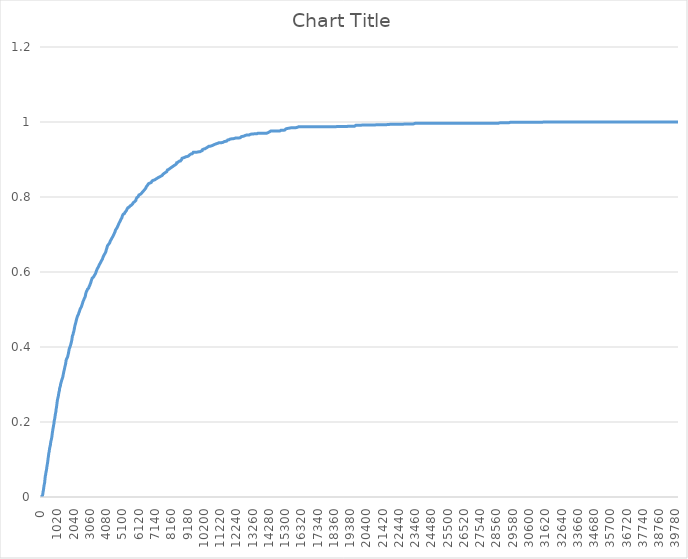
| Category | Series 0 |
|---|---|
| 0.0 | 0 |
| 20.0 | 0 |
| 40.0 | 0.001 |
| 60.0 | 0.002 |
| 80.0 | 0.004 |
| 100.0 | 0.007 |
| 120.0 | 0.014 |
| 140.0 | 0.018 |
| 160.0 | 0.024 |
| 180.0 | 0.031 |
| 200.0 | 0.034 |
| 220.0 | 0.039 |
| 240.0 | 0.048 |
| 260.0 | 0.056 |
| 280.0 | 0.059 |
| 300.0 | 0.066 |
| 320.0 | 0.068 |
| 340.0 | 0.074 |
| 360.0 | 0.081 |
| 380.0 | 0.085 |
| 400.0 | 0.091 |
| 420.0 | 0.097 |
| 440.0 | 0.104 |
| 460.0 | 0.11 |
| 480.0 | 0.117 |
| 500.0 | 0.12 |
| 520.0 | 0.127 |
| 540.0 | 0.132 |
| 560.0 | 0.135 |
| 580.0 | 0.139 |
| 600.0 | 0.147 |
| 620.0 | 0.149 |
| 640.0 | 0.153 |
| 660.0 | 0.157 |
| 680.0 | 0.164 |
| 700.0 | 0.171 |
| 720.0 | 0.176 |
| 740.0 | 0.182 |
| 760.0 | 0.186 |
| 780.0 | 0.191 |
| 800.0 | 0.196 |
| 820.0 | 0.203 |
| 840.0 | 0.207 |
| 860.0 | 0.211 |
| 880.0 | 0.218 |
| 900.0 | 0.223 |
| 920.0 | 0.226 |
| 940.0 | 0.235 |
| 960.0 | 0.239 |
| 980.0 | 0.245 |
| 1000.0 | 0.253 |
| 1020.0 | 0.258 |
| 1040.0 | 0.261 |
| 1060.0 | 0.266 |
| 1080.0 | 0.27 |
| 1100.0 | 0.276 |
| 1120.0 | 0.28 |
| 1140.0 | 0.283 |
| 1160.0 | 0.29 |
| 1180.0 | 0.292 |
| 1200.0 | 0.295 |
| 1220.0 | 0.301 |
| 1240.0 | 0.304 |
| 1260.0 | 0.305 |
| 1280.0 | 0.31 |
| 1300.0 | 0.313 |
| 1320.0 | 0.315 |
| 1340.0 | 0.318 |
| 1360.0 | 0.321 |
| 1380.0 | 0.326 |
| 1400.0 | 0.33 |
| 1420.0 | 0.334 |
| 1440.0 | 0.338 |
| 1460.0 | 0.341 |
| 1480.0 | 0.346 |
| 1500.0 | 0.348 |
| 1520.0 | 0.353 |
| 1540.0 | 0.356 |
| 1560.0 | 0.363 |
| 1580.0 | 0.367 |
| 1600.0 | 0.369 |
| 1620.0 | 0.37 |
| 1640.0 | 0.372 |
| 1660.0 | 0.374 |
| 1680.0 | 0.378 |
| 1700.0 | 0.381 |
| 1720.0 | 0.383 |
| 1740.0 | 0.39 |
| 1760.0 | 0.395 |
| 1780.0 | 0.397 |
| 1800.0 | 0.399 |
| 1820.0 | 0.401 |
| 1840.0 | 0.404 |
| 1860.0 | 0.405 |
| 1880.0 | 0.411 |
| 1900.0 | 0.414 |
| 1920.0 | 0.418 |
| 1940.0 | 0.424 |
| 1960.0 | 0.43 |
| 1980.0 | 0.431 |
| 2000.0 | 0.433 |
| 2020.0 | 0.438 |
| 2040.0 | 0.44 |
| 2060.0 | 0.443 |
| 2080.0 | 0.448 |
| 2100.0 | 0.453 |
| 2120.0 | 0.457 |
| 2140.0 | 0.46 |
| 2160.0 | 0.463 |
| 2180.0 | 0.465 |
| 2200.0 | 0.471 |
| 2220.0 | 0.473 |
| 2240.0 | 0.477 |
| 2260.0 | 0.479 |
| 2280.0 | 0.483 |
| 2300.0 | 0.484 |
| 2320.0 | 0.485 |
| 2340.0 | 0.487 |
| 2360.0 | 0.491 |
| 2380.0 | 0.492 |
| 2400.0 | 0.495 |
| 2420.0 | 0.495 |
| 2440.0 | 0.501 |
| 2460.0 | 0.502 |
| 2480.0 | 0.503 |
| 2500.0 | 0.503 |
| 2520.0 | 0.507 |
| 2540.0 | 0.509 |
| 2560.0 | 0.512 |
| 2580.0 | 0.514 |
| 2600.0 | 0.518 |
| 2620.0 | 0.521 |
| 2640.0 | 0.523 |
| 2660.0 | 0.524 |
| 2680.0 | 0.526 |
| 2700.0 | 0.527 |
| 2720.0 | 0.531 |
| 2740.0 | 0.532 |
| 2760.0 | 0.534 |
| 2780.0 | 0.538 |
| 2800.0 | 0.542 |
| 2820.0 | 0.545 |
| 2840.0 | 0.548 |
| 2860.0 | 0.549 |
| 2880.0 | 0.551 |
| 2900.0 | 0.554 |
| 2920.0 | 0.555 |
| 2940.0 | 0.556 |
| 2960.0 | 0.556 |
| 2980.0 | 0.557 |
| 3000.0 | 0.56 |
| 3020.0 | 0.562 |
| 3040.0 | 0.564 |
| 3060.0 | 0.566 |
| 3080.0 | 0.568 |
| 3100.0 | 0.571 |
| 3120.0 | 0.573 |
| 3140.0 | 0.576 |
| 3160.0 | 0.578 |
| 3180.0 | 0.581 |
| 3200.0 | 0.584 |
| 3220.0 | 0.585 |
| 3240.0 | 0.585 |
| 3260.0 | 0.586 |
| 3280.0 | 0.586 |
| 3300.0 | 0.586 |
| 3320.0 | 0.588 |
| 3340.0 | 0.591 |
| 3360.0 | 0.591 |
| 3380.0 | 0.592 |
| 3400.0 | 0.595 |
| 3420.0 | 0.598 |
| 3440.0 | 0.6 |
| 3460.0 | 0.602 |
| 3480.0 | 0.604 |
| 3500.0 | 0.607 |
| 3520.0 | 0.607 |
| 3540.0 | 0.609 |
| 3560.0 | 0.612 |
| 3580.0 | 0.613 |
| 3600.0 | 0.614 |
| 3620.0 | 0.617 |
| 3640.0 | 0.619 |
| 3660.0 | 0.62 |
| 3680.0 | 0.622 |
| 3700.0 | 0.623 |
| 3720.0 | 0.625 |
| 3740.0 | 0.625 |
| 3760.0 | 0.626 |
| 3780.0 | 0.63 |
| 3800.0 | 0.631 |
| 3820.0 | 0.631 |
| 3840.0 | 0.634 |
| 3860.0 | 0.637 |
| 3880.0 | 0.638 |
| 3900.0 | 0.642 |
| 3920.0 | 0.644 |
| 3940.0 | 0.644 |
| 3960.0 | 0.647 |
| 3980.0 | 0.648 |
| 4000.0 | 0.649 |
| 4020.0 | 0.651 |
| 4040.0 | 0.653 |
| 4060.0 | 0.654 |
| 4080.0 | 0.659 |
| 4100.0 | 0.66 |
| 4120.0 | 0.663 |
| 4140.0 | 0.667 |
| 4160.0 | 0.67 |
| 4180.0 | 0.671 |
| 4200.0 | 0.672 |
| 4220.0 | 0.673 |
| 4240.0 | 0.675 |
| 4260.0 | 0.675 |
| 4280.0 | 0.676 |
| 4300.0 | 0.678 |
| 4320.0 | 0.681 |
| 4340.0 | 0.682 |
| 4360.0 | 0.684 |
| 4380.0 | 0.686 |
| 4400.0 | 0.686 |
| 4420.0 | 0.689 |
| 4440.0 | 0.689 |
| 4460.0 | 0.692 |
| 4480.0 | 0.694 |
| 4500.0 | 0.695 |
| 4520.0 | 0.697 |
| 4540.0 | 0.697 |
| 4560.0 | 0.7 |
| 4580.0 | 0.702 |
| 4600.0 | 0.704 |
| 4620.0 | 0.706 |
| 4640.0 | 0.708 |
| 4660.0 | 0.711 |
| 4680.0 | 0.712 |
| 4700.0 | 0.714 |
| 4720.0 | 0.714 |
| 4740.0 | 0.716 |
| 4760.0 | 0.718 |
| 4780.0 | 0.72 |
| 4800.0 | 0.722 |
| 4820.0 | 0.724 |
| 4840.0 | 0.726 |
| 4860.0 | 0.727 |
| 4880.0 | 0.73 |
| 4900.0 | 0.731 |
| 4920.0 | 0.733 |
| 4940.0 | 0.735 |
| 4960.0 | 0.736 |
| 4980.0 | 0.738 |
| 5000.0 | 0.74 |
| 5020.0 | 0.74 |
| 5040.0 | 0.741 |
| 5060.0 | 0.744 |
| 5080.0 | 0.747 |
| 5100.0 | 0.75 |
| 5120.0 | 0.751 |
| 5140.0 | 0.754 |
| 5160.0 | 0.755 |
| 5180.0 | 0.755 |
| 5200.0 | 0.755 |
| 5220.0 | 0.756 |
| 5240.0 | 0.757 |
| 5260.0 | 0.759 |
| 5280.0 | 0.76 |
| 5300.0 | 0.76 |
| 5320.0 | 0.762 |
| 5340.0 | 0.763 |
| 5360.0 | 0.766 |
| 5380.0 | 0.767 |
| 5400.0 | 0.768 |
| 5420.0 | 0.769 |
| 5440.0 | 0.771 |
| 5460.0 | 0.772 |
| 5480.0 | 0.772 |
| 5500.0 | 0.772 |
| 5520.0 | 0.773 |
| 5540.0 | 0.774 |
| 5560.0 | 0.775 |
| 5580.0 | 0.776 |
| 5600.0 | 0.776 |
| 5620.0 | 0.777 |
| 5640.0 | 0.778 |
| 5660.0 | 0.778 |
| 5680.0 | 0.778 |
| 5700.0 | 0.78 |
| 5720.0 | 0.78 |
| 5740.0 | 0.782 |
| 5760.0 | 0.784 |
| 5780.0 | 0.785 |
| 5800.0 | 0.785 |
| 5820.0 | 0.785 |
| 5840.0 | 0.788 |
| 5860.0 | 0.788 |
| 5880.0 | 0.788 |
| 5900.0 | 0.789 |
| 5920.0 | 0.789 |
| 5940.0 | 0.791 |
| 5960.0 | 0.795 |
| 5980.0 | 0.797 |
| 6000.0 | 0.798 |
| 6020.0 | 0.799 |
| 6040.0 | 0.8 |
| 6060.0 | 0.8 |
| 6080.0 | 0.801 |
| 6100.0 | 0.803 |
| 6120.0 | 0.803 |
| 6140.0 | 0.806 |
| 6160.0 | 0.806 |
| 6180.0 | 0.806 |
| 6200.0 | 0.806 |
| 6220.0 | 0.807 |
| 6240.0 | 0.809 |
| 6260.0 | 0.809 |
| 6280.0 | 0.809 |
| 6300.0 | 0.81 |
| 6320.0 | 0.812 |
| 6340.0 | 0.812 |
| 6360.0 | 0.813 |
| 6380.0 | 0.815 |
| 6400.0 | 0.815 |
| 6420.0 | 0.815 |
| 6440.0 | 0.817 |
| 6460.0 | 0.818 |
| 6480.0 | 0.819 |
| 6500.0 | 0.82 |
| 6520.0 | 0.821 |
| 6540.0 | 0.822 |
| 6560.0 | 0.823 |
| 6580.0 | 0.826 |
| 6600.0 | 0.828 |
| 6620.0 | 0.828 |
| 6640.0 | 0.829 |
| 6660.0 | 0.831 |
| 6680.0 | 0.831 |
| 6700.0 | 0.831 |
| 6720.0 | 0.832 |
| 6740.0 | 0.836 |
| 6760.0 | 0.836 |
| 6780.0 | 0.836 |
| 6800.0 | 0.837 |
| 6820.0 | 0.837 |
| 6840.0 | 0.837 |
| 6860.0 | 0.837 |
| 6880.0 | 0.837 |
| 6900.0 | 0.839 |
| 6920.0 | 0.839 |
| 6940.0 | 0.84 |
| 6960.0 | 0.843 |
| 6980.0 | 0.844 |
| 7000.0 | 0.844 |
| 7020.0 | 0.844 |
| 7040.0 | 0.845 |
| 7060.0 | 0.845 |
| 7080.0 | 0.845 |
| 7100.0 | 0.845 |
| 7120.0 | 0.846 |
| 7140.0 | 0.846 |
| 7160.0 | 0.846 |
| 7180.0 | 0.847 |
| 7200.0 | 0.848 |
| 7220.0 | 0.848 |
| 7240.0 | 0.849 |
| 7260.0 | 0.849 |
| 7280.0 | 0.85 |
| 7300.0 | 0.851 |
| 7320.0 | 0.852 |
| 7340.0 | 0.852 |
| 7360.0 | 0.852 |
| 7380.0 | 0.853 |
| 7400.0 | 0.853 |
| 7420.0 | 0.853 |
| 7440.0 | 0.854 |
| 7460.0 | 0.855 |
| 7480.0 | 0.855 |
| 7500.0 | 0.856 |
| 7520.0 | 0.856 |
| 7540.0 | 0.856 |
| 7560.0 | 0.857 |
| 7580.0 | 0.857 |
| 7600.0 | 0.858 |
| 7620.0 | 0.858 |
| 7640.0 | 0.861 |
| 7660.0 | 0.861 |
| 7680.0 | 0.861 |
| 7700.0 | 0.863 |
| 7720.0 | 0.863 |
| 7740.0 | 0.864 |
| 7760.0 | 0.865 |
| 7780.0 | 0.866 |
| 7800.0 | 0.866 |
| 7820.0 | 0.866 |
| 7840.0 | 0.866 |
| 7860.0 | 0.867 |
| 7880.0 | 0.868 |
| 7900.0 | 0.87 |
| 7920.0 | 0.872 |
| 7940.0 | 0.873 |
| 7960.0 | 0.874 |
| 7980.0 | 0.874 |
| 8000.0 | 0.874 |
| 8020.0 | 0.875 |
| 8040.0 | 0.875 |
| 8060.0 | 0.875 |
| 8080.0 | 0.876 |
| 8100.0 | 0.876 |
| 8120.0 | 0.878 |
| 8140.0 | 0.878 |
| 8160.0 | 0.879 |
| 8180.0 | 0.879 |
| 8200.0 | 0.88 |
| 8220.0 | 0.881 |
| 8240.0 | 0.881 |
| 8260.0 | 0.881 |
| 8280.0 | 0.881 |
| 8300.0 | 0.883 |
| 8320.0 | 0.883 |
| 8340.0 | 0.884 |
| 8360.0 | 0.884 |
| 8380.0 | 0.885 |
| 8400.0 | 0.886 |
| 8420.0 | 0.886 |
| 8440.0 | 0.886 |
| 8460.0 | 0.887 |
| 8480.0 | 0.888 |
| 8500.0 | 0.891 |
| 8520.0 | 0.891 |
| 8540.0 | 0.891 |
| 8560.0 | 0.892 |
| 8580.0 | 0.892 |
| 8600.0 | 0.893 |
| 8620.0 | 0.893 |
| 8640.0 | 0.894 |
| 8660.0 | 0.896 |
| 8680.0 | 0.896 |
| 8700.0 | 0.896 |
| 8720.0 | 0.896 |
| 8740.0 | 0.896 |
| 8760.0 | 0.896 |
| 8780.0 | 0.898 |
| 8800.0 | 0.899 |
| 8820.0 | 0.901 |
| 8840.0 | 0.903 |
| 8860.0 | 0.903 |
| 8880.0 | 0.903 |
| 8900.0 | 0.903 |
| 8920.0 | 0.904 |
| 8940.0 | 0.904 |
| 8960.0 | 0.905 |
| 8980.0 | 0.905 |
| 9000.0 | 0.906 |
| 9020.0 | 0.906 |
| 9040.0 | 0.906 |
| 9060.0 | 0.907 |
| 9080.0 | 0.907 |
| 9100.0 | 0.907 |
| 9120.0 | 0.908 |
| 9140.0 | 0.908 |
| 9160.0 | 0.908 |
| 9180.0 | 0.909 |
| 9200.0 | 0.909 |
| 9220.0 | 0.909 |
| 9240.0 | 0.909 |
| 9260.0 | 0.909 |
| 9280.0 | 0.91 |
| 9300.0 | 0.912 |
| 9320.0 | 0.912 |
| 9340.0 | 0.914 |
| 9360.0 | 0.914 |
| 9380.0 | 0.914 |
| 9400.0 | 0.915 |
| 9420.0 | 0.915 |
| 9440.0 | 0.915 |
| 9460.0 | 0.915 |
| 9480.0 | 0.915 |
| 9500.0 | 0.917 |
| 9520.0 | 0.918 |
| 9540.0 | 0.919 |
| 9560.0 | 0.919 |
| 9580.0 | 0.92 |
| 9600.0 | 0.92 |
| 9620.0 | 0.92 |
| 9640.0 | 0.92 |
| 9660.0 | 0.92 |
| 9680.0 | 0.92 |
| 9700.0 | 0.92 |
| 9720.0 | 0.92 |
| 9740.0 | 0.92 |
| 9760.0 | 0.92 |
| 9780.0 | 0.92 |
| 9800.0 | 0.92 |
| 9820.0 | 0.92 |
| 9840.0 | 0.92 |
| 9860.0 | 0.92 |
| 9880.0 | 0.92 |
| 9900.0 | 0.92 |
| 9920.0 | 0.92 |
| 9940.0 | 0.92 |
| 9960.0 | 0.92 |
| 9980.0 | 0.921 |
| 10000.0 | 0.922 |
| 10020.0 | 0.922 |
| 10040.0 | 0.923 |
| 10060.0 | 0.923 |
| 10080.0 | 0.924 |
| 10100.0 | 0.924 |
| 10120.0 | 0.926 |
| 10140.0 | 0.926 |
| 10160.0 | 0.926 |
| 10180.0 | 0.928 |
| 10200.0 | 0.928 |
| 10220.0 | 0.928 |
| 10240.0 | 0.929 |
| 10260.0 | 0.929 |
| 10280.0 | 0.929 |
| 10300.0 | 0.931 |
| 10320.0 | 0.931 |
| 10340.0 | 0.931 |
| 10360.0 | 0.931 |
| 10380.0 | 0.932 |
| 10400.0 | 0.932 |
| 10420.0 | 0.933 |
| 10440.0 | 0.933 |
| 10460.0 | 0.934 |
| 10480.0 | 0.934 |
| 10500.0 | 0.935 |
| 10520.0 | 0.935 |
| 10540.0 | 0.935 |
| 10560.0 | 0.935 |
| 10580.0 | 0.935 |
| 10600.0 | 0.935 |
| 10620.0 | 0.935 |
| 10640.0 | 0.935 |
| 10660.0 | 0.936 |
| 10680.0 | 0.936 |
| 10700.0 | 0.936 |
| 10720.0 | 0.936 |
| 10740.0 | 0.937 |
| 10760.0 | 0.938 |
| 10780.0 | 0.939 |
| 10800.0 | 0.939 |
| 10820.0 | 0.939 |
| 10840.0 | 0.939 |
| 10860.0 | 0.94 |
| 10880.0 | 0.941 |
| 10900.0 | 0.941 |
| 10920.0 | 0.941 |
| 10940.0 | 0.942 |
| 10960.0 | 0.942 |
| 10980.0 | 0.942 |
| 11000.0 | 0.942 |
| 11020.0 | 0.943 |
| 11040.0 | 0.943 |
| 11060.0 | 0.943 |
| 11080.0 | 0.943 |
| 11100.0 | 0.944 |
| 11120.0 | 0.945 |
| 11140.0 | 0.945 |
| 11160.0 | 0.945 |
| 11180.0 | 0.945 |
| 11200.0 | 0.945 |
| 11220.0 | 0.945 |
| 11240.0 | 0.945 |
| 11260.0 | 0.945 |
| 11280.0 | 0.945 |
| 11300.0 | 0.945 |
| 11320.0 | 0.945 |
| 11340.0 | 0.945 |
| 11360.0 | 0.945 |
| 11380.0 | 0.945 |
| 11400.0 | 0.946 |
| 11420.0 | 0.948 |
| 11440.0 | 0.948 |
| 11460.0 | 0.948 |
| 11480.0 | 0.948 |
| 11500.0 | 0.948 |
| 11520.0 | 0.948 |
| 11540.0 | 0.948 |
| 11560.0 | 0.948 |
| 11580.0 | 0.949 |
| 11600.0 | 0.949 |
| 11620.0 | 0.949 |
| 11640.0 | 0.949 |
| 11660.0 | 0.949 |
| 11680.0 | 0.95 |
| 11700.0 | 0.952 |
| 11720.0 | 0.952 |
| 11740.0 | 0.952 |
| 11760.0 | 0.953 |
| 11780.0 | 0.953 |
| 11800.0 | 0.953 |
| 11820.0 | 0.954 |
| 11840.0 | 0.954 |
| 11860.0 | 0.954 |
| 11880.0 | 0.954 |
| 11900.0 | 0.954 |
| 11920.0 | 0.955 |
| 11940.0 | 0.955 |
| 11960.0 | 0.955 |
| 11980.0 | 0.955 |
| 12000.0 | 0.955 |
| 12020.0 | 0.955 |
| 12040.0 | 0.956 |
| 12060.0 | 0.956 |
| 12080.0 | 0.956 |
| 12100.0 | 0.956 |
| 12120.0 | 0.957 |
| 12140.0 | 0.957 |
| 12160.0 | 0.957 |
| 12180.0 | 0.957 |
| 12200.0 | 0.957 |
| 12220.0 | 0.957 |
| 12240.0 | 0.957 |
| 12260.0 | 0.957 |
| 12280.0 | 0.957 |
| 12300.0 | 0.957 |
| 12320.0 | 0.957 |
| 12340.0 | 0.957 |
| 12360.0 | 0.957 |
| 12380.0 | 0.957 |
| 12400.0 | 0.957 |
| 12420.0 | 0.957 |
| 12440.0 | 0.957 |
| 12460.0 | 0.957 |
| 12480.0 | 0.958 |
| 12500.0 | 0.958 |
| 12520.0 | 0.958 |
| 12540.0 | 0.958 |
| 12560.0 | 0.961 |
| 12580.0 | 0.961 |
| 12600.0 | 0.962 |
| 12620.0 | 0.962 |
| 12640.0 | 0.962 |
| 12660.0 | 0.962 |
| 12680.0 | 0.962 |
| 12700.0 | 0.962 |
| 12720.0 | 0.962 |
| 12740.0 | 0.963 |
| 12760.0 | 0.963 |
| 12780.0 | 0.963 |
| 12800.0 | 0.964 |
| 12820.0 | 0.964 |
| 12840.0 | 0.965 |
| 12860.0 | 0.965 |
| 12880.0 | 0.965 |
| 12900.0 | 0.965 |
| 12920.0 | 0.965 |
| 12940.0 | 0.965 |
| 12960.0 | 0.965 |
| 12980.0 | 0.965 |
| 13000.0 | 0.965 |
| 13020.0 | 0.965 |
| 13040.0 | 0.965 |
| 13060.0 | 0.965 |
| 13080.0 | 0.966 |
| 13100.0 | 0.967 |
| 13120.0 | 0.967 |
| 13140.0 | 0.968 |
| 13160.0 | 0.968 |
| 13180.0 | 0.968 |
| 13200.0 | 0.968 |
| 13220.0 | 0.968 |
| 13240.0 | 0.968 |
| 13260.0 | 0.968 |
| 13280.0 | 0.968 |
| 13300.0 | 0.968 |
| 13320.0 | 0.968 |
| 13340.0 | 0.968 |
| 13360.0 | 0.968 |
| 13380.0 | 0.968 |
| 13400.0 | 0.968 |
| 13420.0 | 0.968 |
| 13440.0 | 0.968 |
| 13460.0 | 0.968 |
| 13480.0 | 0.968 |
| 13500.0 | 0.968 |
| 13520.0 | 0.968 |
| 13540.0 | 0.968 |
| 13560.0 | 0.97 |
| 13580.0 | 0.97 |
| 13600.0 | 0.97 |
| 13620.0 | 0.97 |
| 13640.0 | 0.97 |
| 13660.0 | 0.97 |
| 13680.0 | 0.97 |
| 13700.0 | 0.97 |
| 13720.0 | 0.97 |
| 13740.0 | 0.97 |
| 13760.0 | 0.97 |
| 13780.0 | 0.97 |
| 13800.0 | 0.97 |
| 13820.0 | 0.97 |
| 13840.0 | 0.97 |
| 13860.0 | 0.97 |
| 13880.0 | 0.97 |
| 13900.0 | 0.97 |
| 13920.0 | 0.97 |
| 13940.0 | 0.97 |
| 13960.0 | 0.97 |
| 13980.0 | 0.97 |
| 14000.0 | 0.97 |
| 14020.0 | 0.97 |
| 14040.0 | 0.97 |
| 14060.0 | 0.97 |
| 14080.0 | 0.97 |
| 14100.0 | 0.97 |
| 14120.0 | 0.97 |
| 14140.0 | 0.97 |
| 14160.0 | 0.97 |
| 14180.0 | 0.97 |
| 14200.0 | 0.971 |
| 14220.0 | 0.971 |
| 14240.0 | 0.972 |
| 14260.0 | 0.973 |
| 14280.0 | 0.973 |
| 14300.0 | 0.973 |
| 14320.0 | 0.974 |
| 14340.0 | 0.974 |
| 14360.0 | 0.975 |
| 14380.0 | 0.975 |
| 14400.0 | 0.976 |
| 14420.0 | 0.976 |
| 14440.0 | 0.976 |
| 14460.0 | 0.976 |
| 14480.0 | 0.976 |
| 14500.0 | 0.976 |
| 14520.0 | 0.976 |
| 14540.0 | 0.976 |
| 14560.0 | 0.976 |
| 14580.0 | 0.976 |
| 14600.0 | 0.976 |
| 14620.0 | 0.976 |
| 14640.0 | 0.976 |
| 14660.0 | 0.976 |
| 14680.0 | 0.976 |
| 14700.0 | 0.976 |
| 14720.0 | 0.976 |
| 14740.0 | 0.976 |
| 14760.0 | 0.976 |
| 14780.0 | 0.976 |
| 14800.0 | 0.976 |
| 14820.0 | 0.976 |
| 14840.0 | 0.976 |
| 14860.0 | 0.976 |
| 14880.0 | 0.976 |
| 14900.0 | 0.976 |
| 14920.0 | 0.976 |
| 14940.0 | 0.976 |
| 14960.0 | 0.976 |
| 14980.0 | 0.976 |
| 15000.0 | 0.976 |
| 15020.0 | 0.978 |
| 15040.0 | 0.978 |
| 15060.0 | 0.978 |
| 15080.0 | 0.978 |
| 15100.0 | 0.978 |
| 15120.0 | 0.978 |
| 15140.0 | 0.978 |
| 15160.0 | 0.978 |
| 15180.0 | 0.978 |
| 15200.0 | 0.978 |
| 15220.0 | 0.979 |
| 15240.0 | 0.979 |
| 15260.0 | 0.979 |
| 15280.0 | 0.979 |
| 15300.0 | 0.979 |
| 15320.0 | 0.981 |
| 15340.0 | 0.981 |
| 15360.0 | 0.982 |
| 15380.0 | 0.982 |
| 15400.0 | 0.982 |
| 15420.0 | 0.982 |
| 15440.0 | 0.982 |
| 15460.0 | 0.982 |
| 15480.0 | 0.983 |
| 15500.0 | 0.983 |
| 15520.0 | 0.983 |
| 15540.0 | 0.984 |
| 15560.0 | 0.984 |
| 15580.0 | 0.984 |
| 15600.0 | 0.984 |
| 15620.0 | 0.984 |
| 15640.0 | 0.984 |
| 15660.0 | 0.984 |
| 15680.0 | 0.984 |
| 15700.0 | 0.984 |
| 15720.0 | 0.984 |
| 15740.0 | 0.984 |
| 15760.0 | 0.984 |
| 15780.0 | 0.985 |
| 15800.0 | 0.985 |
| 15820.0 | 0.985 |
| 15840.0 | 0.985 |
| 15860.0 | 0.985 |
| 15880.0 | 0.985 |
| 15900.0 | 0.985 |
| 15920.0 | 0.985 |
| 15940.0 | 0.985 |
| 15960.0 | 0.985 |
| 15980.0 | 0.985 |
| 16000.0 | 0.986 |
| 16020.0 | 0.986 |
| 16040.0 | 0.986 |
| 16060.0 | 0.986 |
| 16080.0 | 0.986 |
| 16100.0 | 0.987 |
| 16120.0 | 0.987 |
| 16140.0 | 0.987 |
| 16160.0 | 0.987 |
| 16180.0 | 0.987 |
| 16200.0 | 0.987 |
| 16220.0 | 0.987 |
| 16240.0 | 0.987 |
| 16260.0 | 0.987 |
| 16280.0 | 0.987 |
| 16300.0 | 0.987 |
| 16320.0 | 0.987 |
| 16340.0 | 0.987 |
| 16360.0 | 0.987 |
| 16380.0 | 0.987 |
| 16400.0 | 0.987 |
| 16420.0 | 0.987 |
| 16440.0 | 0.987 |
| 16460.0 | 0.987 |
| 16480.0 | 0.987 |
| 16500.0 | 0.987 |
| 16520.0 | 0.987 |
| 16540.0 | 0.987 |
| 16560.0 | 0.987 |
| 16580.0 | 0.987 |
| 16600.0 | 0.987 |
| 16620.0 | 0.987 |
| 16640.0 | 0.987 |
| 16660.0 | 0.987 |
| 16680.0 | 0.987 |
| 16700.0 | 0.987 |
| 16720.0 | 0.987 |
| 16740.0 | 0.987 |
| 16760.0 | 0.987 |
| 16780.0 | 0.987 |
| 16800.0 | 0.987 |
| 16820.0 | 0.987 |
| 16840.0 | 0.987 |
| 16860.0 | 0.987 |
| 16880.0 | 0.987 |
| 16900.0 | 0.987 |
| 16920.0 | 0.987 |
| 16940.0 | 0.987 |
| 16960.0 | 0.987 |
| 16980.0 | 0.987 |
| 17000.0 | 0.987 |
| 17020.0 | 0.987 |
| 17040.0 | 0.987 |
| 17060.0 | 0.987 |
| 17080.0 | 0.987 |
| 17100.0 | 0.987 |
| 17120.0 | 0.987 |
| 17140.0 | 0.987 |
| 17160.0 | 0.987 |
| 17180.0 | 0.987 |
| 17200.0 | 0.987 |
| 17220.0 | 0.987 |
| 17240.0 | 0.987 |
| 17260.0 | 0.987 |
| 17280.0 | 0.987 |
| 17300.0 | 0.987 |
| 17320.0 | 0.987 |
| 17340.0 | 0.987 |
| 17360.0 | 0.987 |
| 17380.0 | 0.987 |
| 17400.0 | 0.987 |
| 17420.0 | 0.987 |
| 17440.0 | 0.987 |
| 17460.0 | 0.987 |
| 17480.0 | 0.987 |
| 17500.0 | 0.987 |
| 17520.0 | 0.987 |
| 17540.0 | 0.987 |
| 17560.0 | 0.987 |
| 17580.0 | 0.987 |
| 17600.0 | 0.987 |
| 17620.0 | 0.987 |
| 17640.0 | 0.987 |
| 17660.0 | 0.987 |
| 17680.0 | 0.987 |
| 17700.0 | 0.987 |
| 17720.0 | 0.987 |
| 17740.0 | 0.987 |
| 17760.0 | 0.987 |
| 17780.0 | 0.987 |
| 17800.0 | 0.987 |
| 17820.0 | 0.987 |
| 17840.0 | 0.987 |
| 17860.0 | 0.987 |
| 17880.0 | 0.987 |
| 17900.0 | 0.987 |
| 17920.0 | 0.987 |
| 17940.0 | 0.987 |
| 17960.0 | 0.987 |
| 17980.0 | 0.987 |
| 18000.0 | 0.987 |
| 18020.0 | 0.987 |
| 18040.0 | 0.987 |
| 18060.0 | 0.987 |
| 18080.0 | 0.987 |
| 18100.0 | 0.987 |
| 18120.0 | 0.987 |
| 18140.0 | 0.987 |
| 18160.0 | 0.987 |
| 18180.0 | 0.987 |
| 18200.0 | 0.987 |
| 18220.0 | 0.987 |
| 18240.0 | 0.987 |
| 18260.0 | 0.987 |
| 18280.0 | 0.987 |
| 18300.0 | 0.987 |
| 18320.0 | 0.987 |
| 18340.0 | 0.987 |
| 18360.0 | 0.987 |
| 18380.0 | 0.987 |
| 18400.0 | 0.987 |
| 18420.0 | 0.987 |
| 18440.0 | 0.987 |
| 18460.0 | 0.987 |
| 18480.0 | 0.987 |
| 18500.0 | 0.987 |
| 18520.0 | 0.988 |
| 18540.0 | 0.988 |
| 18560.0 | 0.988 |
| 18580.0 | 0.988 |
| 18600.0 | 0.988 |
| 18620.0 | 0.988 |
| 18640.0 | 0.988 |
| 18660.0 | 0.988 |
| 18680.0 | 0.988 |
| 18700.0 | 0.988 |
| 18720.0 | 0.988 |
| 18740.0 | 0.988 |
| 18760.0 | 0.988 |
| 18780.0 | 0.988 |
| 18800.0 | 0.988 |
| 18820.0 | 0.988 |
| 18840.0 | 0.988 |
| 18860.0 | 0.988 |
| 18880.0 | 0.988 |
| 18900.0 | 0.988 |
| 18920.0 | 0.988 |
| 18940.0 | 0.988 |
| 18960.0 | 0.988 |
| 18980.0 | 0.988 |
| 19000.0 | 0.988 |
| 19020.0 | 0.988 |
| 19040.0 | 0.988 |
| 19060.0 | 0.988 |
| 19080.0 | 0.988 |
| 19100.0 | 0.988 |
| 19120.0 | 0.988 |
| 19140.0 | 0.988 |
| 19160.0 | 0.988 |
| 19180.0 | 0.988 |
| 19200.0 | 0.989 |
| 19220.0 | 0.989 |
| 19240.0 | 0.989 |
| 19260.0 | 0.989 |
| 19280.0 | 0.989 |
| 19300.0 | 0.989 |
| 19320.0 | 0.989 |
| 19340.0 | 0.989 |
| 19360.0 | 0.989 |
| 19380.0 | 0.989 |
| 19400.0 | 0.989 |
| 19420.0 | 0.989 |
| 19440.0 | 0.989 |
| 19460.0 | 0.989 |
| 19480.0 | 0.989 |
| 19500.0 | 0.989 |
| 19520.0 | 0.989 |
| 19540.0 | 0.989 |
| 19560.0 | 0.989 |
| 19580.0 | 0.989 |
| 19600.0 | 0.989 |
| 19620.0 | 0.989 |
| 19640.0 | 0.989 |
| 19660.0 | 0.989 |
| 19680.0 | 0.991 |
| 19700.0 | 0.991 |
| 19720.0 | 0.991 |
| 19740.0 | 0.991 |
| 19760.0 | 0.991 |
| 19780.0 | 0.991 |
| 19800.0 | 0.991 |
| 19820.0 | 0.991 |
| 19840.0 | 0.991 |
| 19860.0 | 0.991 |
| 19880.0 | 0.991 |
| 19900.0 | 0.991 |
| 19920.0 | 0.991 |
| 19940.0 | 0.991 |
| 19960.0 | 0.991 |
| 19980.0 | 0.991 |
| 20000.0 | 0.991 |
| 20020.0 | 0.991 |
| 20040.0 | 0.991 |
| 20060.0 | 0.991 |
| 20080.0 | 0.991 |
| 20100.0 | 0.991 |
| 20120.0 | 0.991 |
| 20140.0 | 0.992 |
| 20160.0 | 0.992 |
| 20180.0 | 0.992 |
| 20200.0 | 0.992 |
| 20220.0 | 0.992 |
| 20240.0 | 0.992 |
| 20260.0 | 0.992 |
| 20280.0 | 0.992 |
| 20300.0 | 0.992 |
| 20320.0 | 0.992 |
| 20340.0 | 0.992 |
| 20360.0 | 0.992 |
| 20380.0 | 0.992 |
| 20400.0 | 0.992 |
| 20420.0 | 0.992 |
| 20440.0 | 0.992 |
| 20460.0 | 0.992 |
| 20480.0 | 0.992 |
| 20500.0 | 0.992 |
| 20520.0 | 0.992 |
| 20540.0 | 0.992 |
| 20560.0 | 0.992 |
| 20580.0 | 0.992 |
| 20600.0 | 0.992 |
| 20620.0 | 0.992 |
| 20640.0 | 0.992 |
| 20660.0 | 0.992 |
| 20680.0 | 0.992 |
| 20700.0 | 0.992 |
| 20720.0 | 0.992 |
| 20740.0 | 0.992 |
| 20760.0 | 0.992 |
| 20780.0 | 0.992 |
| 20800.0 | 0.992 |
| 20820.0 | 0.992 |
| 20840.0 | 0.992 |
| 20860.0 | 0.992 |
| 20880.0 | 0.992 |
| 20900.0 | 0.992 |
| 20920.0 | 0.992 |
| 20940.0 | 0.992 |
| 20960.0 | 0.992 |
| 20980.0 | 0.993 |
| 21000.0 | 0.993 |
| 21020.0 | 0.993 |
| 21040.0 | 0.993 |
| 21060.0 | 0.993 |
| 21080.0 | 0.993 |
| 21100.0 | 0.993 |
| 21120.0 | 0.993 |
| 21140.0 | 0.993 |
| 21160.0 | 0.993 |
| 21180.0 | 0.993 |
| 21200.0 | 0.993 |
| 21220.0 | 0.993 |
| 21240.0 | 0.993 |
| 21260.0 | 0.993 |
| 21280.0 | 0.993 |
| 21300.0 | 0.993 |
| 21320.0 | 0.993 |
| 21340.0 | 0.993 |
| 21360.0 | 0.993 |
| 21380.0 | 0.993 |
| 21400.0 | 0.993 |
| 21420.0 | 0.993 |
| 21440.0 | 0.993 |
| 21460.0 | 0.993 |
| 21480.0 | 0.993 |
| 21500.0 | 0.993 |
| 21520.0 | 0.993 |
| 21540.0 | 0.993 |
| 21560.0 | 0.993 |
| 21580.0 | 0.993 |
| 21600.0 | 0.993 |
| 21620.0 | 0.993 |
| 21640.0 | 0.993 |
| 21660.0 | 0.993 |
| 21680.0 | 0.993 |
| 21700.0 | 0.993 |
| 21720.0 | 0.993 |
| 21740.0 | 0.993 |
| 21760.0 | 0.993 |
| 21780.0 | 0.993 |
| 21800.0 | 0.993 |
| 21820.0 | 0.993 |
| 21840.0 | 0.993 |
| 21860.0 | 0.993 |
| 21880.0 | 0.994 |
| 21900.0 | 0.994 |
| 21920.0 | 0.994 |
| 21940.0 | 0.994 |
| 21960.0 | 0.994 |
| 21980.0 | 0.994 |
| 22000.0 | 0.994 |
| 22020.0 | 0.994 |
| 22040.0 | 0.994 |
| 22060.0 | 0.994 |
| 22080.0 | 0.994 |
| 22100.0 | 0.994 |
| 22120.0 | 0.994 |
| 22140.0 | 0.994 |
| 22160.0 | 0.994 |
| 22180.0 | 0.994 |
| 22200.0 | 0.994 |
| 22220.0 | 0.994 |
| 22240.0 | 0.994 |
| 22260.0 | 0.994 |
| 22280.0 | 0.994 |
| 22300.0 | 0.994 |
| 22320.0 | 0.994 |
| 22340.0 | 0.994 |
| 22360.0 | 0.994 |
| 22380.0 | 0.994 |
| 22400.0 | 0.994 |
| 22420.0 | 0.994 |
| 22440.0 | 0.994 |
| 22460.0 | 0.994 |
| 22480.0 | 0.994 |
| 22500.0 | 0.994 |
| 22520.0 | 0.994 |
| 22540.0 | 0.994 |
| 22560.0 | 0.994 |
| 22580.0 | 0.994 |
| 22600.0 | 0.994 |
| 22620.0 | 0.994 |
| 22640.0 | 0.994 |
| 22660.0 | 0.994 |
| 22680.0 | 0.994 |
| 22700.0 | 0.994 |
| 22720.0 | 0.995 |
| 22740.0 | 0.995 |
| 22760.0 | 0.995 |
| 22780.0 | 0.995 |
| 22800.0 | 0.995 |
| 22820.0 | 0.995 |
| 22840.0 | 0.995 |
| 22860.0 | 0.995 |
| 22880.0 | 0.995 |
| 22900.0 | 0.995 |
| 22920.0 | 0.995 |
| 22940.0 | 0.995 |
| 22960.0 | 0.995 |
| 22980.0 | 0.995 |
| 23000.0 | 0.995 |
| 23020.0 | 0.995 |
| 23040.0 | 0.995 |
| 23060.0 | 0.995 |
| 23080.0 | 0.995 |
| 23100.0 | 0.995 |
| 23120.0 | 0.995 |
| 23140.0 | 0.995 |
| 23160.0 | 0.995 |
| 23180.0 | 0.995 |
| 23200.0 | 0.995 |
| 23220.0 | 0.995 |
| 23240.0 | 0.995 |
| 23260.0 | 0.995 |
| 23280.0 | 0.995 |
| 23300.0 | 0.995 |
| 23320.0 | 0.995 |
| 23340.0 | 0.995 |
| 23360.0 | 0.995 |
| 23380.0 | 0.995 |
| 23400.0 | 0.996 |
| 23420.0 | 0.996 |
| 23440.0 | 0.996 |
| 23460.0 | 0.996 |
| 23480.0 | 0.997 |
| 23500.0 | 0.997 |
| 23520.0 | 0.997 |
| 23540.0 | 0.997 |
| 23560.0 | 0.997 |
| 23580.0 | 0.997 |
| 23600.0 | 0.997 |
| 23620.0 | 0.997 |
| 23640.0 | 0.997 |
| 23660.0 | 0.997 |
| 23680.0 | 0.997 |
| 23700.0 | 0.997 |
| 23720.0 | 0.997 |
| 23740.0 | 0.997 |
| 23760.0 | 0.997 |
| 23780.0 | 0.997 |
| 23800.0 | 0.997 |
| 23820.0 | 0.997 |
| 23840.0 | 0.997 |
| 23860.0 | 0.997 |
| 23880.0 | 0.997 |
| 23900.0 | 0.997 |
| 23920.0 | 0.997 |
| 23940.0 | 0.997 |
| 23960.0 | 0.997 |
| 23980.0 | 0.997 |
| 24000.0 | 0.997 |
| 24020.0 | 0.997 |
| 24040.0 | 0.997 |
| 24060.0 | 0.997 |
| 24080.0 | 0.997 |
| 24100.0 | 0.997 |
| 24120.0 | 0.997 |
| 24140.0 | 0.997 |
| 24160.0 | 0.997 |
| 24180.0 | 0.997 |
| 24200.0 | 0.997 |
| 24220.0 | 0.997 |
| 24240.0 | 0.997 |
| 24260.0 | 0.997 |
| 24280.0 | 0.997 |
| 24300.0 | 0.997 |
| 24320.0 | 0.997 |
| 24340.0 | 0.997 |
| 24360.0 | 0.997 |
| 24380.0 | 0.997 |
| 24400.0 | 0.997 |
| 24420.0 | 0.997 |
| 24440.0 | 0.997 |
| 24460.0 | 0.997 |
| 24480.0 | 0.997 |
| 24500.0 | 0.997 |
| 24520.0 | 0.997 |
| 24540.0 | 0.997 |
| 24560.0 | 0.997 |
| 24580.0 | 0.997 |
| 24600.0 | 0.997 |
| 24620.0 | 0.997 |
| 24640.0 | 0.997 |
| 24660.0 | 0.997 |
| 24680.0 | 0.997 |
| 24700.0 | 0.997 |
| 24720.0 | 0.997 |
| 24740.0 | 0.997 |
| 24760.0 | 0.997 |
| 24780.0 | 0.997 |
| 24800.0 | 0.997 |
| 24820.0 | 0.997 |
| 24840.0 | 0.997 |
| 24860.0 | 0.997 |
| 24880.0 | 0.997 |
| 24900.0 | 0.997 |
| 24920.0 | 0.997 |
| 24940.0 | 0.997 |
| 24960.0 | 0.997 |
| 24980.0 | 0.997 |
| 25000.0 | 0.997 |
| 25020.0 | 0.997 |
| 25040.0 | 0.997 |
| 25060.0 | 0.997 |
| 25080.0 | 0.997 |
| 25100.0 | 0.997 |
| 25120.0 | 0.997 |
| 25140.0 | 0.997 |
| 25160.0 | 0.997 |
| 25180.0 | 0.997 |
| 25200.0 | 0.997 |
| 25220.0 | 0.997 |
| 25240.0 | 0.997 |
| 25260.0 | 0.997 |
| 25280.0 | 0.997 |
| 25300.0 | 0.997 |
| 25320.0 | 0.997 |
| 25340.0 | 0.997 |
| 25360.0 | 0.997 |
| 25380.0 | 0.997 |
| 25400.0 | 0.997 |
| 25420.0 | 0.997 |
| 25440.0 | 0.997 |
| 25460.0 | 0.997 |
| 25480.0 | 0.997 |
| 25500.0 | 0.997 |
| 25520.0 | 0.997 |
| 25540.0 | 0.997 |
| 25560.0 | 0.997 |
| 25580.0 | 0.997 |
| 25600.0 | 0.997 |
| 25620.0 | 0.997 |
| 25640.0 | 0.997 |
| 25660.0 | 0.997 |
| 25680.0 | 0.997 |
| 25700.0 | 0.997 |
| 25720.0 | 0.997 |
| 25740.0 | 0.997 |
| 25760.0 | 0.997 |
| 25780.0 | 0.997 |
| 25800.0 | 0.997 |
| 25820.0 | 0.997 |
| 25840.0 | 0.997 |
| 25860.0 | 0.997 |
| 25880.0 | 0.997 |
| 25900.0 | 0.997 |
| 25920.0 | 0.997 |
| 25940.0 | 0.997 |
| 25960.0 | 0.997 |
| 25980.0 | 0.997 |
| 26000.0 | 0.997 |
| 26020.0 | 0.997 |
| 26040.0 | 0.997 |
| 26060.0 | 0.997 |
| 26080.0 | 0.997 |
| 26100.0 | 0.997 |
| 26120.0 | 0.997 |
| 26140.0 | 0.997 |
| 26160.0 | 0.997 |
| 26180.0 | 0.997 |
| 26200.0 | 0.997 |
| 26220.0 | 0.997 |
| 26240.0 | 0.997 |
| 26260.0 | 0.997 |
| 26280.0 | 0.997 |
| 26300.0 | 0.997 |
| 26320.0 | 0.997 |
| 26340.0 | 0.997 |
| 26360.0 | 0.997 |
| 26380.0 | 0.997 |
| 26400.0 | 0.997 |
| 26420.0 | 0.997 |
| 26440.0 | 0.997 |
| 26460.0 | 0.997 |
| 26480.0 | 0.997 |
| 26500.0 | 0.997 |
| 26520.0 | 0.997 |
| 26540.0 | 0.997 |
| 26560.0 | 0.997 |
| 26580.0 | 0.997 |
| 26600.0 | 0.997 |
| 26620.0 | 0.997 |
| 26640.0 | 0.997 |
| 26660.0 | 0.997 |
| 26680.0 | 0.997 |
| 26700.0 | 0.997 |
| 26720.0 | 0.997 |
| 26740.0 | 0.997 |
| 26760.0 | 0.997 |
| 26780.0 | 0.997 |
| 26800.0 | 0.997 |
| 26820.0 | 0.997 |
| 26840.0 | 0.997 |
| 26860.0 | 0.997 |
| 26880.0 | 0.997 |
| 26900.0 | 0.997 |
| 26920.0 | 0.997 |
| 26940.0 | 0.997 |
| 26960.0 | 0.997 |
| 26980.0 | 0.997 |
| 27000.0 | 0.997 |
| 27020.0 | 0.997 |
| 27040.0 | 0.997 |
| 27060.0 | 0.997 |
| 27080.0 | 0.997 |
| 27100.0 | 0.997 |
| 27120.0 | 0.997 |
| 27140.0 | 0.997 |
| 27160.0 | 0.997 |
| 27180.0 | 0.997 |
| 27200.0 | 0.997 |
| 27220.0 | 0.997 |
| 27240.0 | 0.997 |
| 27260.0 | 0.997 |
| 27280.0 | 0.997 |
| 27300.0 | 0.997 |
| 27320.0 | 0.997 |
| 27340.0 | 0.997 |
| 27360.0 | 0.997 |
| 27380.0 | 0.997 |
| 27400.0 | 0.997 |
| 27420.0 | 0.997 |
| 27440.0 | 0.997 |
| 27460.0 | 0.997 |
| 27480.0 | 0.997 |
| 27500.0 | 0.997 |
| 27520.0 | 0.997 |
| 27540.0 | 0.997 |
| 27560.0 | 0.997 |
| 27580.0 | 0.997 |
| 27600.0 | 0.997 |
| 27620.0 | 0.997 |
| 27640.0 | 0.997 |
| 27660.0 | 0.997 |
| 27680.0 | 0.997 |
| 27700.0 | 0.997 |
| 27720.0 | 0.997 |
| 27740.0 | 0.997 |
| 27760.0 | 0.997 |
| 27780.0 | 0.997 |
| 27800.0 | 0.997 |
| 27820.0 | 0.997 |
| 27840.0 | 0.997 |
| 27860.0 | 0.997 |
| 27880.0 | 0.997 |
| 27900.0 | 0.997 |
| 27920.0 | 0.997 |
| 27940.0 | 0.997 |
| 27960.0 | 0.997 |
| 27980.0 | 0.997 |
| 28000.0 | 0.997 |
| 28020.0 | 0.997 |
| 28040.0 | 0.997 |
| 28060.0 | 0.997 |
| 28080.0 | 0.997 |
| 28100.0 | 0.997 |
| 28120.0 | 0.997 |
| 28140.0 | 0.997 |
| 28160.0 | 0.997 |
| 28180.0 | 0.997 |
| 28200.0 | 0.997 |
| 28220.0 | 0.997 |
| 28240.0 | 0.997 |
| 28260.0 | 0.997 |
| 28280.0 | 0.997 |
| 28300.0 | 0.997 |
| 28320.0 | 0.997 |
| 28340.0 | 0.997 |
| 28360.0 | 0.997 |
| 28380.0 | 0.997 |
| 28400.0 | 0.997 |
| 28420.0 | 0.997 |
| 28440.0 | 0.997 |
| 28460.0 | 0.997 |
| 28480.0 | 0.997 |
| 28500.0 | 0.997 |
| 28520.0 | 0.997 |
| 28540.0 | 0.997 |
| 28560.0 | 0.997 |
| 28580.0 | 0.997 |
| 28600.0 | 0.997 |
| 28620.0 | 0.997 |
| 28640.0 | 0.997 |
| 28660.0 | 0.997 |
| 28680.0 | 0.997 |
| 28700.0 | 0.997 |
| 28720.0 | 0.997 |
| 28740.0 | 0.998 |
| 28760.0 | 0.998 |
| 28780.0 | 0.998 |
| 28800.0 | 0.998 |
| 28820.0 | 0.998 |
| 28840.0 | 0.998 |
| 28860.0 | 0.998 |
| 28880.0 | 0.998 |
| 28900.0 | 0.998 |
| 28920.0 | 0.998 |
| 28940.0 | 0.998 |
| 28960.0 | 0.998 |
| 28980.0 | 0.998 |
| 29000.0 | 0.998 |
| 29020.0 | 0.998 |
| 29040.0 | 0.998 |
| 29060.0 | 0.998 |
| 29080.0 | 0.998 |
| 29100.0 | 0.998 |
| 29120.0 | 0.998 |
| 29140.0 | 0.998 |
| 29160.0 | 0.998 |
| 29180.0 | 0.998 |
| 29200.0 | 0.998 |
| 29220.0 | 0.998 |
| 29240.0 | 0.998 |
| 29260.0 | 0.998 |
| 29280.0 | 0.998 |
| 29300.0 | 0.998 |
| 29320.0 | 0.998 |
| 29340.0 | 0.998 |
| 29360.0 | 0.998 |
| 29380.0 | 0.998 |
| 29400.0 | 0.999 |
| 29420.0 | 0.999 |
| 29440.0 | 0.999 |
| 29460.0 | 0.999 |
| 29480.0 | 0.999 |
| 29500.0 | 0.999 |
| 29520.0 | 0.999 |
| 29540.0 | 0.999 |
| 29560.0 | 0.999 |
| 29580.0 | 0.999 |
| 29600.0 | 0.999 |
| 29620.0 | 0.999 |
| 29640.0 | 0.999 |
| 29660.0 | 0.999 |
| 29680.0 | 0.999 |
| 29700.0 | 0.999 |
| 29720.0 | 0.999 |
| 29740.0 | 0.999 |
| 29760.0 | 0.999 |
| 29780.0 | 0.999 |
| 29800.0 | 0.999 |
| 29820.0 | 0.999 |
| 29840.0 | 0.999 |
| 29860.0 | 0.999 |
| 29880.0 | 0.999 |
| 29900.0 | 0.999 |
| 29920.0 | 0.999 |
| 29940.0 | 0.999 |
| 29960.0 | 0.999 |
| 29980.0 | 0.999 |
| 30000.0 | 0.999 |
| 30020.0 | 0.999 |
| 30040.0 | 0.999 |
| 30060.0 | 0.999 |
| 30080.0 | 0.999 |
| 30100.0 | 0.999 |
| 30120.0 | 0.999 |
| 30140.0 | 0.999 |
| 30160.0 | 0.999 |
| 30180.0 | 0.999 |
| 30200.0 | 0.999 |
| 30220.0 | 0.999 |
| 30240.0 | 0.999 |
| 30260.0 | 0.999 |
| 30280.0 | 0.999 |
| 30300.0 | 0.999 |
| 30320.0 | 0.999 |
| 30340.0 | 0.999 |
| 30360.0 | 0.999 |
| 30380.0 | 0.999 |
| 30400.0 | 0.999 |
| 30420.0 | 0.999 |
| 30440.0 | 0.999 |
| 30460.0 | 0.999 |
| 30480.0 | 0.999 |
| 30500.0 | 0.999 |
| 30520.0 | 0.999 |
| 30540.0 | 0.999 |
| 30560.0 | 0.999 |
| 30580.0 | 0.999 |
| 30600.0 | 0.999 |
| 30620.0 | 0.999 |
| 30640.0 | 0.999 |
| 30660.0 | 0.999 |
| 30680.0 | 0.999 |
| 30700.0 | 0.999 |
| 30720.0 | 0.999 |
| 30740.0 | 0.999 |
| 30760.0 | 0.999 |
| 30780.0 | 0.999 |
| 30800.0 | 0.999 |
| 30820.0 | 0.999 |
| 30840.0 | 0.999 |
| 30860.0 | 0.999 |
| 30880.0 | 0.999 |
| 30900.0 | 0.999 |
| 30920.0 | 0.999 |
| 30940.0 | 0.999 |
| 30960.0 | 0.999 |
| 30980.0 | 0.999 |
| 31000.0 | 0.999 |
| 31020.0 | 0.999 |
| 31040.0 | 0.999 |
| 31060.0 | 0.999 |
| 31080.0 | 0.999 |
| 31100.0 | 0.999 |
| 31120.0 | 0.999 |
| 31140.0 | 0.999 |
| 31160.0 | 0.999 |
| 31180.0 | 0.999 |
| 31200.0 | 0.999 |
| 31220.0 | 0.999 |
| 31240.0 | 0.999 |
| 31260.0 | 0.999 |
| 31280.0 | 0.999 |
| 31300.0 | 0.999 |
| 31320.0 | 0.999 |
| 31340.0 | 0.999 |
| 31360.0 | 0.999 |
| 31380.0 | 0.999 |
| 31400.0 | 0.999 |
| 31420.0 | 0.999 |
| 31440.0 | 1 |
| 31460.0 | 1 |
| 31480.0 | 1 |
| 31500.0 | 1 |
| 31520.0 | 1 |
| 31540.0 | 1 |
| 31560.0 | 1 |
| 31580.0 | 1 |
| 31600.0 | 1 |
| 31620.0 | 1 |
| 31640.0 | 1 |
| 31660.0 | 1 |
| 31680.0 | 1 |
| 31700.0 | 1 |
| 31720.0 | 1 |
| 31740.0 | 1 |
| 31760.0 | 1 |
| 31780.0 | 1 |
| 31800.0 | 1 |
| 31820.0 | 1 |
| 31840.0 | 1 |
| 31860.0 | 1 |
| 31880.0 | 1 |
| 31900.0 | 1 |
| 31920.0 | 1 |
| 31940.0 | 1 |
| 31960.0 | 1 |
| 31980.0 | 1 |
| 32000.0 | 1 |
| 32020.0 | 1 |
| 32040.0 | 1 |
| 32060.0 | 1 |
| 32080.0 | 1 |
| 32100.0 | 1 |
| 32120.0 | 1 |
| 32140.0 | 1 |
| 32160.0 | 1 |
| 32180.0 | 1 |
| 32200.0 | 1 |
| 32220.0 | 1 |
| 32240.0 | 1 |
| 32260.0 | 1 |
| 32280.0 | 1 |
| 32300.0 | 1 |
| 32320.0 | 1 |
| 32340.0 | 1 |
| 32360.0 | 1 |
| 32380.0 | 1 |
| 32400.0 | 1 |
| 32420.0 | 1 |
| 32440.0 | 1 |
| 32460.0 | 1 |
| 32480.0 | 1 |
| 32500.0 | 1 |
| 32520.0 | 1 |
| 32540.0 | 1 |
| 32560.0 | 1 |
| 32580.0 | 1 |
| 32600.0 | 1 |
| 32620.0 | 1 |
| 32640.0 | 1 |
| 32660.0 | 1 |
| 32680.0 | 1 |
| 32700.0 | 1 |
| 32720.0 | 1 |
| 32740.0 | 1 |
| 32760.0 | 1 |
| 32780.0 | 1 |
| 32800.0 | 1 |
| 32820.0 | 1 |
| 32840.0 | 1 |
| 32860.0 | 1 |
| 32880.0 | 1 |
| 32900.0 | 1 |
| 32920.0 | 1 |
| 32940.0 | 1 |
| 32960.0 | 1 |
| 32980.0 | 1 |
| 33000.0 | 1 |
| 33020.0 | 1 |
| 33040.0 | 1 |
| 33060.0 | 1 |
| 33080.0 | 1 |
| 33100.0 | 1 |
| 33120.0 | 1 |
| 33140.0 | 1 |
| 33160.0 | 1 |
| 33180.0 | 1 |
| 33200.0 | 1 |
| 33220.0 | 1 |
| 33240.0 | 1 |
| 33260.0 | 1 |
| 33280.0 | 1 |
| 33300.0 | 1 |
| 33320.0 | 1 |
| 33340.0 | 1 |
| 33360.0 | 1 |
| 33380.0 | 1 |
| 33400.0 | 1 |
| 33420.0 | 1 |
| 33440.0 | 1 |
| 33460.0 | 1 |
| 33480.0 | 1 |
| 33500.0 | 1 |
| 33520.0 | 1 |
| 33540.0 | 1 |
| 33560.0 | 1 |
| 33580.0 | 1 |
| 33600.0 | 1 |
| 33620.0 | 1 |
| 33640.0 | 1 |
| 33660.0 | 1 |
| 33680.0 | 1 |
| 33700.0 | 1 |
| 33720.0 | 1 |
| 33740.0 | 1 |
| 33760.0 | 1 |
| 33780.0 | 1 |
| 33800.0 | 1 |
| 33820.0 | 1 |
| 33840.0 | 1 |
| 33860.0 | 1 |
| 33880.0 | 1 |
| 33900.0 | 1 |
| 33920.0 | 1 |
| 33940.0 | 1 |
| 33960.0 | 1 |
| 33980.0 | 1 |
| 34000.0 | 1 |
| 34020.0 | 1 |
| 34040.0 | 1 |
| 34060.0 | 1 |
| 34080.0 | 1 |
| 34100.0 | 1 |
| 34120.0 | 1 |
| 34140.0 | 1 |
| 34160.0 | 1 |
| 34180.0 | 1 |
| 34200.0 | 1 |
| 34220.0 | 1 |
| 34240.0 | 1 |
| 34260.0 | 1 |
| 34280.0 | 1 |
| 34300.0 | 1 |
| 34320.0 | 1 |
| 34340.0 | 1 |
| 34360.0 | 1 |
| 34380.0 | 1 |
| 34400.0 | 1 |
| 34420.0 | 1 |
| 34440.0 | 1 |
| 34460.0 | 1 |
| 34480.0 | 1 |
| 34500.0 | 1 |
| 34520.0 | 1 |
| 34540.0 | 1 |
| 34560.0 | 1 |
| 34580.0 | 1 |
| 34600.0 | 1 |
| 34620.0 | 1 |
| 34640.0 | 1 |
| 34660.0 | 1 |
| 34680.0 | 1 |
| 34700.0 | 1 |
| 34720.0 | 1 |
| 34740.0 | 1 |
| 34760.0 | 1 |
| 34780.0 | 1 |
| 34800.0 | 1 |
| 34820.0 | 1 |
| 34840.0 | 1 |
| 34860.0 | 1 |
| 34880.0 | 1 |
| 34900.0 | 1 |
| 34920.0 | 1 |
| 34940.0 | 1 |
| 34960.0 | 1 |
| 34980.0 | 1 |
| 35000.0 | 1 |
| 35020.0 | 1 |
| 35040.0 | 1 |
| 35060.0 | 1 |
| 35080.0 | 1 |
| 35100.0 | 1 |
| 35120.0 | 1 |
| 35140.0 | 1 |
| 35160.0 | 1 |
| 35180.0 | 1 |
| 35200.0 | 1 |
| 35220.0 | 1 |
| 35240.0 | 1 |
| 35260.0 | 1 |
| 35280.0 | 1 |
| 35300.0 | 1 |
| 35320.0 | 1 |
| 35340.0 | 1 |
| 35360.0 | 1 |
| 35380.0 | 1 |
| 35400.0 | 1 |
| 35420.0 | 1 |
| 35440.0 | 1 |
| 35460.0 | 1 |
| 35480.0 | 1 |
| 35500.0 | 1 |
| 35520.0 | 1 |
| 35540.0 | 1 |
| 35560.0 | 1 |
| 35580.0 | 1 |
| 35600.0 | 1 |
| 35620.0 | 1 |
| 35640.0 | 1 |
| 35660.0 | 1 |
| 35680.0 | 1 |
| 35700.0 | 1 |
| 35720.0 | 1 |
| 35740.0 | 1 |
| 35760.0 | 1 |
| 35780.0 | 1 |
| 35800.0 | 1 |
| 35820.0 | 1 |
| 35840.0 | 1 |
| 35860.0 | 1 |
| 35880.0 | 1 |
| 35900.0 | 1 |
| 35920.0 | 1 |
| 35940.0 | 1 |
| 35960.0 | 1 |
| 35980.0 | 1 |
| 36000.0 | 1 |
| 36020.0 | 1 |
| 36040.0 | 1 |
| 36060.0 | 1 |
| 36080.0 | 1 |
| 36100.0 | 1 |
| 36120.0 | 1 |
| 36140.0 | 1 |
| 36160.0 | 1 |
| 36180.0 | 1 |
| 36200.0 | 1 |
| 36220.0 | 1 |
| 36240.0 | 1 |
| 36260.0 | 1 |
| 36280.0 | 1 |
| 36300.0 | 1 |
| 36320.0 | 1 |
| 36340.0 | 1 |
| 36360.0 | 1 |
| 36380.0 | 1 |
| 36400.0 | 1 |
| 36420.0 | 1 |
| 36440.0 | 1 |
| 36460.0 | 1 |
| 36480.0 | 1 |
| 36500.0 | 1 |
| 36520.0 | 1 |
| 36540.0 | 1 |
| 36560.0 | 1 |
| 36580.0 | 1 |
| 36600.0 | 1 |
| 36620.0 | 1 |
| 36640.0 | 1 |
| 36660.0 | 1 |
| 36680.0 | 1 |
| 36700.0 | 1 |
| 36720.0 | 1 |
| 36740.0 | 1 |
| 36760.0 | 1 |
| 36780.0 | 1 |
| 36800.0 | 1 |
| 36820.0 | 1 |
| 36840.0 | 1 |
| 36860.0 | 1 |
| 36880.0 | 1 |
| 36900.0 | 1 |
| 36920.0 | 1 |
| 36940.0 | 1 |
| 36960.0 | 1 |
| 36980.0 | 1 |
| 37000.0 | 1 |
| 37020.0 | 1 |
| 37040.0 | 1 |
| 37060.0 | 1 |
| 37080.0 | 1 |
| 37100.0 | 1 |
| 37120.0 | 1 |
| 37140.0 | 1 |
| 37160.0 | 1 |
| 37180.0 | 1 |
| 37200.0 | 1 |
| 37220.0 | 1 |
| 37240.0 | 1 |
| 37260.0 | 1 |
| 37280.0 | 1 |
| 37300.0 | 1 |
| 37320.0 | 1 |
| 37340.0 | 1 |
| 37360.0 | 1 |
| 37380.0 | 1 |
| 37400.0 | 1 |
| 37420.0 | 1 |
| 37440.0 | 1 |
| 37460.0 | 1 |
| 37480.0 | 1 |
| 37500.0 | 1 |
| 37520.0 | 1 |
| 37540.0 | 1 |
| 37560.0 | 1 |
| 37580.0 | 1 |
| 37600.0 | 1 |
| 37620.0 | 1 |
| 37640.0 | 1 |
| 37660.0 | 1 |
| 37680.0 | 1 |
| 37700.0 | 1 |
| 37720.0 | 1 |
| 37740.0 | 1 |
| 37760.0 | 1 |
| 37780.0 | 1 |
| 37800.0 | 1 |
| 37820.0 | 1 |
| 37840.0 | 1 |
| 37860.0 | 1 |
| 37880.0 | 1 |
| 37900.0 | 1 |
| 37920.0 | 1 |
| 37940.0 | 1 |
| 37960.0 | 1 |
| 37980.0 | 1 |
| 38000.0 | 1 |
| 38020.0 | 1 |
| 38040.0 | 1 |
| 38060.0 | 1 |
| 38080.0 | 1 |
| 38100.0 | 1 |
| 38120.0 | 1 |
| 38140.0 | 1 |
| 38160.0 | 1 |
| 38180.0 | 1 |
| 38200.0 | 1 |
| 38220.0 | 1 |
| 38240.0 | 1 |
| 38260.0 | 1 |
| 38280.0 | 1 |
| 38300.0 | 1 |
| 38320.0 | 1 |
| 38340.0 | 1 |
| 38360.0 | 1 |
| 38380.0 | 1 |
| 38400.0 | 1 |
| 38420.0 | 1 |
| 38440.0 | 1 |
| 38460.0 | 1 |
| 38480.0 | 1 |
| 38500.0 | 1 |
| 38520.0 | 1 |
| 38540.0 | 1 |
| 38560.0 | 1 |
| 38580.0 | 1 |
| 38600.0 | 1 |
| 38620.0 | 1 |
| 38640.0 | 1 |
| 38660.0 | 1 |
| 38680.0 | 1 |
| 38700.0 | 1 |
| 38720.0 | 1 |
| 38740.0 | 1 |
| 38760.0 | 1 |
| 38780.0 | 1 |
| 38800.0 | 1 |
| 38820.0 | 1 |
| 38840.0 | 1 |
| 38860.0 | 1 |
| 38880.0 | 1 |
| 38900.0 | 1 |
| 38920.0 | 1 |
| 38940.0 | 1 |
| 38960.0 | 1 |
| 38980.0 | 1 |
| 39000.0 | 1 |
| 39020.0 | 1 |
| 39040.0 | 1 |
| 39060.0 | 1 |
| 39080.0 | 1 |
| 39100.0 | 1 |
| 39120.0 | 1 |
| 39140.0 | 1 |
| 39160.0 | 1 |
| 39180.0 | 1 |
| 39200.0 | 1 |
| 39220.0 | 1 |
| 39240.0 | 1 |
| 39260.0 | 1 |
| 39280.0 | 1 |
| 39300.0 | 1 |
| 39320.0 | 1 |
| 39340.0 | 1 |
| 39360.0 | 1 |
| 39380.0 | 1 |
| 39400.0 | 1 |
| 39420.0 | 1 |
| 39440.0 | 1 |
| 39460.0 | 1 |
| 39480.0 | 1 |
| 39500.0 | 1 |
| 39520.0 | 1 |
| 39540.0 | 1 |
| 39560.0 | 1 |
| 39580.0 | 1 |
| 39600.0 | 1 |
| 39620.0 | 1 |
| 39640.0 | 1 |
| 39660.0 | 1 |
| 39680.0 | 1 |
| 39700.0 | 1 |
| 39720.0 | 1 |
| 39740.0 | 1 |
| 39760.0 | 1 |
| 39780.0 | 1 |
| 39800.0 | 1 |
| 39820.0 | 1 |
| 39840.0 | 1 |
| 39860.0 | 1 |
| 39880.0 | 1 |
| 39900.0 | 1 |
| 39920.0 | 1 |
| 39940.0 | 1 |
| 39960.0 | 1 |
| 39980.0 | 1 |
| 40000.0 | 1 |